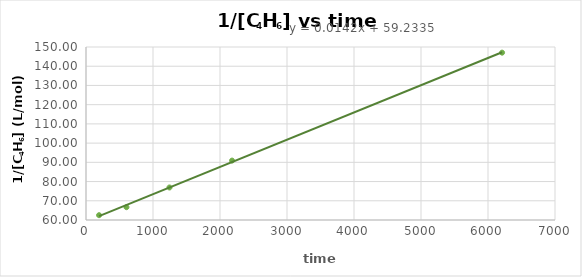
| Category | 1/[C4H6] (L/mol) |
|---|---|
| 195.0 | 62.5 |
| 604.0 | 66.667 |
| 1246.0 | 76.923 |
| 2180.0 | 90.909 |
| 6210.0 | 147.059 |